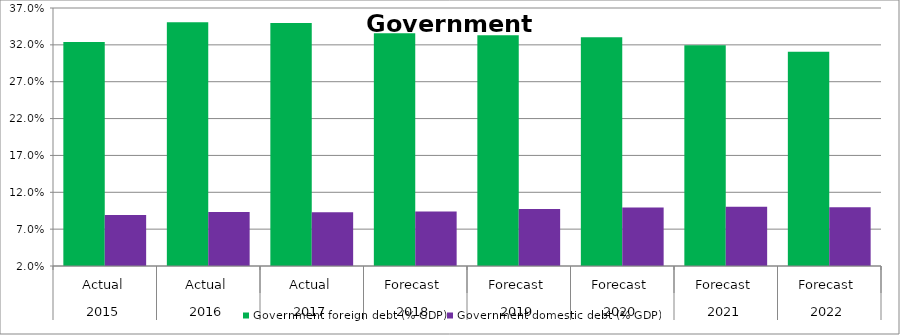
| Category | Government foreign debt (% GDP) | Government domestic debt (% GDP) |
|---|---|---|
| 0 | 0.324 | 0.089 |
| 1 | 0.351 | 0.093 |
| 2 | 0.35 | 0.093 |
| 3 | 0.336 | 0.094 |
| 4 | 0.333 | 0.097 |
| 5 | 0.33 | 0.099 |
| 6 | 0.32 | 0.1 |
| 7 | 0.31 | 0.1 |